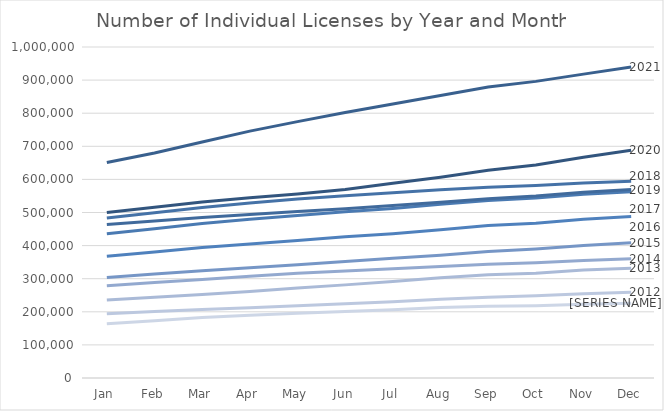
| Category | 2011 | 2012 | 2013 | 2014 | 2015 | 2016 | 2017 | 2018 | 2019 | 2021 | 2020 |
|---|---|---|---|---|---|---|---|---|---|---|---|
| Jan | 163649 | 194424 | 235752 | 278372 | 303635 | 367891 | 435643 | 483621 | 463482 | 650935 | 499934 |
| Feb | 172931 | 201177 | 244282 | 288287 | 314101 | 380842 | 450824 | 499064 | 474057 | 680024 | 516084 |
| Mar | 182881 | 207189 | 252558 | 297656 | 323658 | 394171 | 466914 | 514969 | 484541 | 712821 | 531950 |
| Apr | 189849 | 212368 | 261012 | 307267 | 332948 | 405062 | 479344 | 528827 | 493789 | 745932 | 544637 |
| May | 195612 | 218634 | 272016 | 316172 | 342119 | 415454 | 491284 | 541071 | 502978 | 774467 | 555997 |
| Jun | 201083 | 224375 | 281341 | 323137 | 351940 | 426475 | 502013 | 550661 | 511366 | 802071 | 569676 |
| Jul | 206029 | 230611 | 291641 | 330369 | 361654 | 436032 | 512122 | 559519 | 520994 | 827812 | 588312 |
| Aug | 212930 | 238124 | 302997 | 337083 | 371202 | 447652 | 524793 | 569002 | 531230 | 853175 | 606763 |
| Sep | 216523 | 244165 | 311593 | 343800 | 382291 | 460372 | 536235 | 576473 | 541751 | 879313 | 627338 |
| Oct | 218631 | 248618 | 316614 | 348356 | 389812 | 467836 | 543753 | 581618 | 549656 | 896160 | 643692 |
| Nov | 222925 | 254843 | 326143 | 355187 | 400510 | 479811 | 555117 | 589024 | 561402 | 918005 | 666646 |
| Dec | 226021 | 259005 | 331351 | 359992 | 408542 | 487973 | 562760 | 594041 | 569190 | 939608 | 688315 |